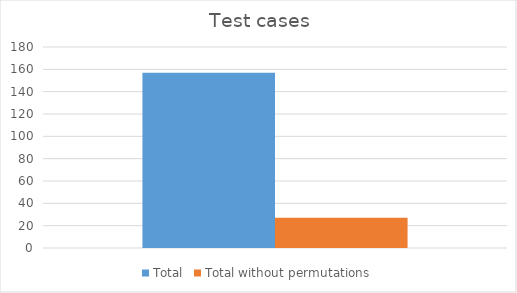
| Category | Total | Total without permutations |
|---|---|---|
| 0 | 157 | 27 |